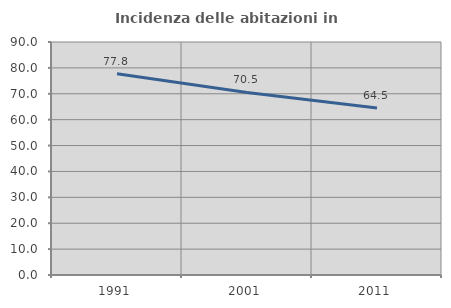
| Category | Incidenza delle abitazioni in proprietà  |
|---|---|
| 1991.0 | 77.765 |
| 2001.0 | 70.536 |
| 2011.0 | 64.478 |